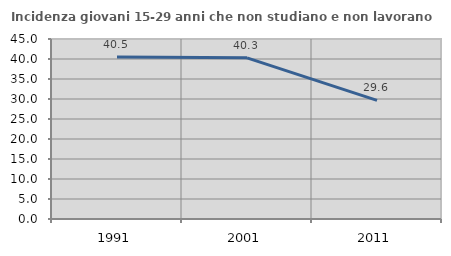
| Category | Incidenza giovani 15-29 anni che non studiano e non lavorano  |
|---|---|
| 1991.0 | 40.476 |
| 2001.0 | 40.299 |
| 2011.0 | 29.645 |